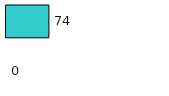
| Category | Series 0 | Series 1 |
|---|---|---|
| 0 | 0 | 74 |